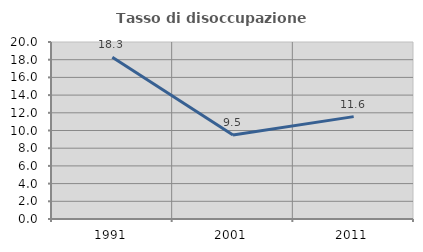
| Category | Tasso di disoccupazione giovanile  |
|---|---|
| 1991.0 | 18.271 |
| 2001.0 | 9.487 |
| 2011.0 | 11.567 |